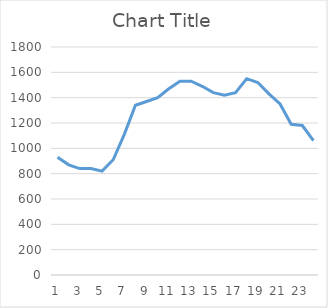
| Category | Series 0 |
|---|---|
| 0 | 930 |
| 1 | 870 |
| 2 | 840 |
| 3 | 840 |
| 4 | 820 |
| 5 | 910 |
| 6 | 1110 |
| 7 | 1340 |
| 8 | 1370 |
| 9 | 1400 |
| 10 | 1470 |
| 11 | 1530 |
| 12 | 1530 |
| 13 | 1490 |
| 14 | 1440 |
| 15 | 1420 |
| 16 | 1440 |
| 17 | 1550 |
| 18 | 1520 |
| 19 | 1430 |
| 20 | 1350 |
| 21 | 1190 |
| 22 | 1180 |
| 23 | 1060 |